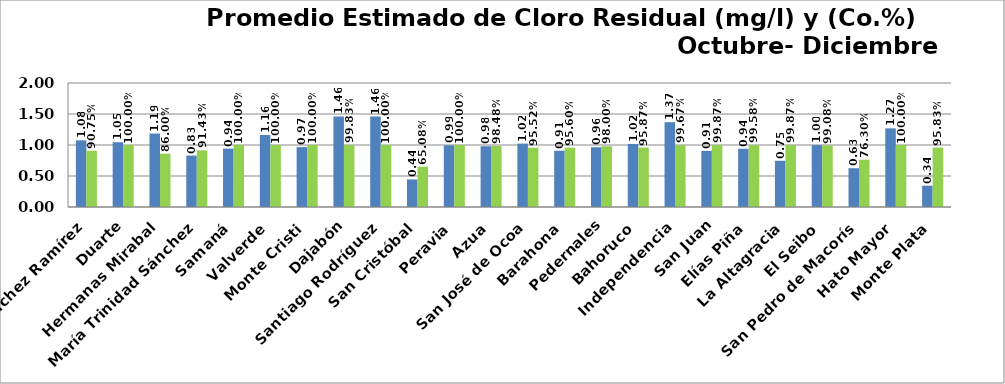
| Category | PROMEDIO TRIMESTRAL (mg/l) | PROMEDIO TRIMESTRAL (Co.%) |
|---|---|---|
| Sánchez Ramírez | 1.075 | 0.908 |
| Duarte | 1.045 | 1 |
| Hermanas Mirabal | 1.185 | 0.86 |
| María Trinidad Sánchez | 0.829 | 0.914 |
| Samaná | 0.942 | 1 |
| Valverde | 1.162 | 1 |
| Monte Cristi | 0.966 | 1 |
| Dajabón | 1.462 | 0.998 |
| Santiago Rodríguez | 1.458 | 1 |
| San Cristóbal | 0.444 | 0.651 |
| Peravia | 0.994 | 1 |
| Azua | 0.98 | 0.985 |
| San José de Ocoa | 1.022 | 0.955 |
| Barahona | 0.908 | 0.956 |
| Pedernales | 0.964 | 0.98 |
| Bahoruco | 1.017 | 0.959 |
| Independencia | 1.368 | 0.997 |
| San Juan | 0.906 | 0.999 |
| Elías Piña | 0.94 | 0.996 |
| La Altagracia | 0.746 | 0.999 |
| El Seibo | 0.998 | 0.991 |
| San Pedro de Macorís | 0.626 | 0.763 |
| Hato Mayor | 1.268 | 1 |
| Monte Plata | 0.343 | 0.958 |